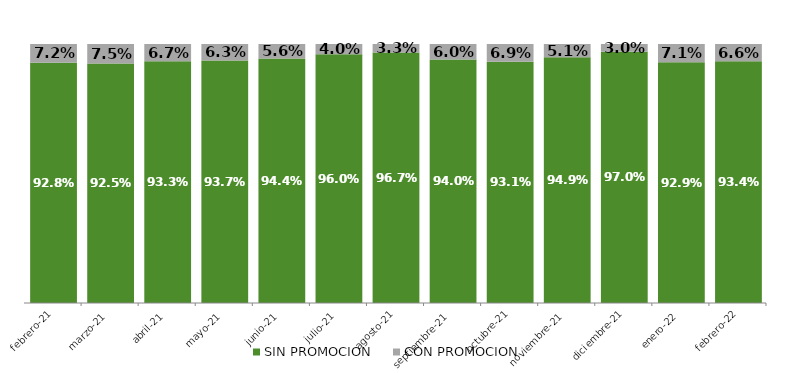
| Category | SIN PROMOCION   | CON PROMOCION   |
|---|---|---|
| 2021-02-01 | 0.928 | 0.072 |
| 2021-03-01 | 0.925 | 0.075 |
| 2021-04-01 | 0.933 | 0.067 |
| 2021-05-01 | 0.937 | 0.063 |
| 2021-06-01 | 0.944 | 0.056 |
| 2021-07-01 | 0.96 | 0.04 |
| 2021-08-01 | 0.967 | 0.033 |
| 2021-09-01 | 0.94 | 0.06 |
| 2021-10-01 | 0.931 | 0.069 |
| 2021-11-01 | 0.949 | 0.051 |
| 2021-12-01 | 0.97 | 0.03 |
| 2022-01-01 | 0.929 | 0.071 |
| 2022-02-01 | 0.934 | 0.066 |